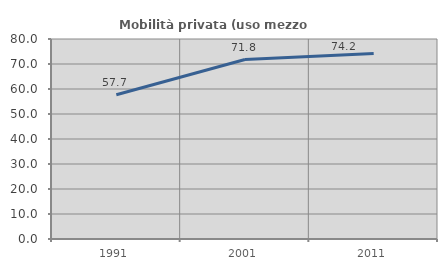
| Category | Mobilità privata (uso mezzo privato) |
|---|---|
| 1991.0 | 57.71 |
| 2001.0 | 71.799 |
| 2011.0 | 74.236 |